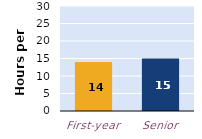
| Category | hours per week |
|---|---|
| First-year | 14 |
| Senior | 15 |